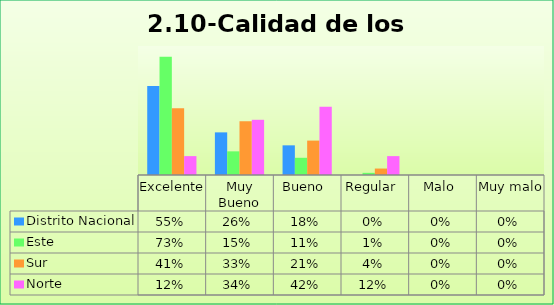
| Category | Distrito Nacional | Este | Sur  | Norte |
|---|---|---|---|---|
| Excelente | 0.552 | 0.733 | 0.413 | 0.117 |
| Muy Bueno | 0.264 | 0.147 | 0.333 | 0.342 |
| Bueno  | 0.184 | 0.107 | 0.213 | 0.423 |
| Regular  | 0 | 0.013 | 0.04 | 0.117 |
| Malo  | 0 | 0 | 0 | 0 |
| Muy malo  | 0 | 0 | 0 | 0 |